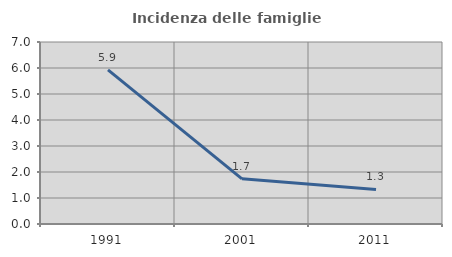
| Category | Incidenza delle famiglie numerose |
|---|---|
| 1991.0 | 5.931 |
| 2001.0 | 1.739 |
| 2011.0 | 1.331 |